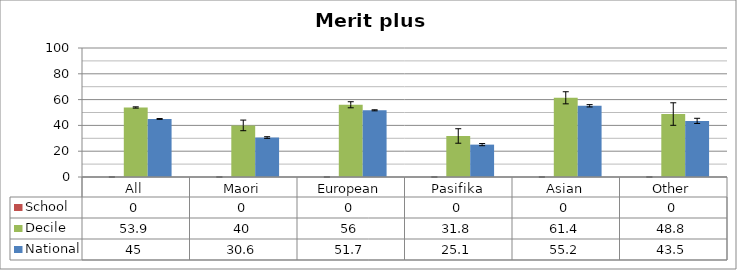
| Category | School | Decile | National |
|---|---|---|---|
| All | 0 | 53.9 | 45 |
| Maori | 0 | 40 | 30.6 |
| European | 0 | 56 | 51.7 |
| Pasifika | 0 | 31.8 | 25.1 |
| Asian | 0 | 61.4 | 55.2 |
| Other | 0 | 48.8 | 43.5 |